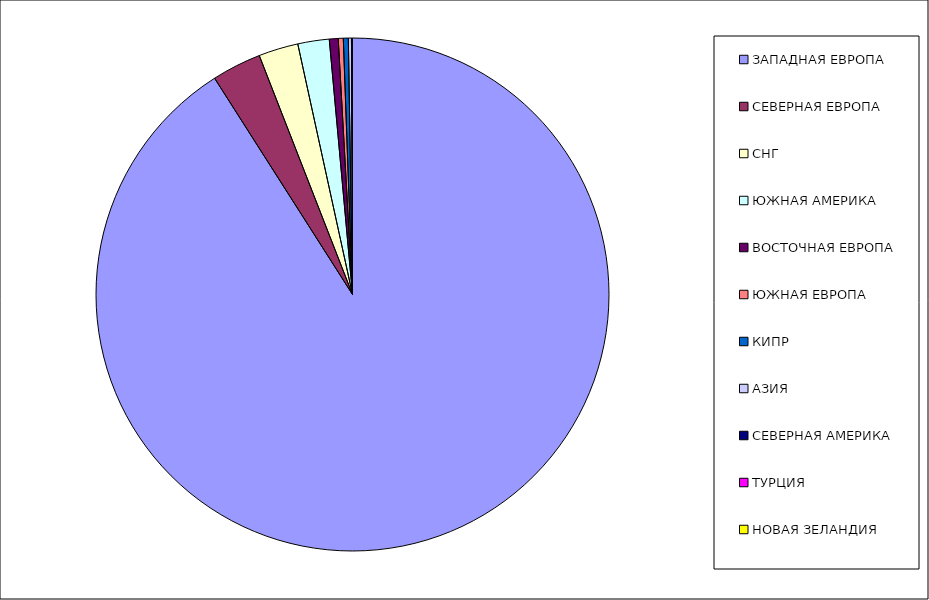
| Category | Оборот |
|---|---|
| ЗАПАДНАЯ ЕВРОПА | 0.91 |
| СЕВЕРНАЯ ЕВРОПА | 0.031 |
| СНГ | 0.025 |
| ЮЖНАЯ АМЕРИКА | 0.02 |
| ВОСТОЧНАЯ ЕВРОПА | 0.006 |
| ЮЖНАЯ ЕВРОПА | 0.003 |
| КИПР | 0.003 |
| АЗИЯ | 0.002 |
| СЕВЕРНАЯ АМЕРИКА | 0.001 |
| ТУРЦИЯ | 0 |
| НОВАЯ ЗЕЛАНДИЯ | 0 |